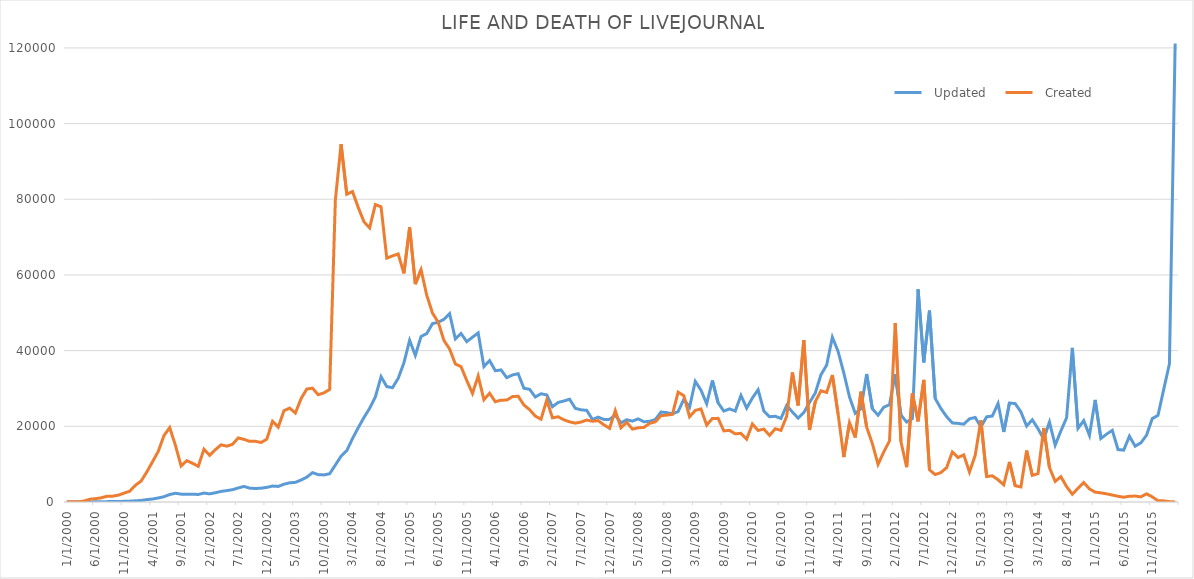
| Category |   Updated |   Created |
|---|---|---|
| 1/1/00 | 3 | 50 |
| 2/1/00 | 9 | 66 |
| 3/1/00 | 7 | 73 |
| 4/1/00 | 8 | 251 |
| 5/1/00 | 20 | 733 |
| 6/1/00 | 39 | 881 |
| 7/1/00 | 63 | 1099 |
| 8/1/00 | 98 | 1513 |
| 9/1/00 | 110 | 1538 |
| 10/1/00 | 137 | 1800 |
| 11/1/00 | 170 | 2334 |
| 12/1/00 | 219 | 2844 |
| 1/1/01 | 314 | 4431 |
| 2/1/01 | 406 | 5539 |
| 3/1/01 | 633 | 7948 |
| 4/1/01 | 791 | 10648 |
| 5/1/01 | 1067 | 13389 |
| 6/1/01 | 1399 | 17559 |
| 7/1/01 | 1977 | 19659 |
| 8/1/01 | 2307 | 14999 |
| 9/1/01 | 2081 | 9531 |
| 10/1/01 | 2029 | 10918 |
| 11/1/01 | 2066 | 10225 |
| 12/1/01 | 1989 | 9430 |
| 1/1/02 | 2359 | 13959 |
| 2/1/02 | 2150 | 12333 |
| 3/1/02 | 2445 | 13839 |
| 4/1/02 | 2801 | 15112 |
| 5/1/02 | 3018 | 14759 |
| 6/1/02 | 3250 | 15256 |
| 7/1/02 | 3707 | 16936 |
| 8/1/02 | 4117 | 16550 |
| 9/1/02 | 3664 | 16032 |
| 10/1/02 | 3564 | 16030 |
| 11/1/02 | 3642 | 15731 |
| 12/1/02 | 3874 | 16600 |
| 1/1/03 | 4209 | 21334 |
| 2/1/03 | 4115 | 19782 |
| 3/1/03 | 4700 | 24133 |
| 4/1/03 | 5074 | 24815 |
| 5/1/03 | 5192 | 23511 |
| 6/1/03 | 5810 | 27328 |
| 7/1/03 | 6570 | 29857 |
| 8/1/03 | 7760 | 30085 |
| 9/1/03 | 7233 | 28350 |
| 10/1/03 | 7158 | 28838 |
| 11/1/03 | 7467 | 29750 |
| 12/1/03 | 9768 | 79818 |
| 1/1/04 | 12117 | 94550 |
| 2/1/04 | 13578 | 81351 |
| 3/1/04 | 16749 | 82034 |
| 4/1/04 | 19624 | 77868 |
| 5/1/04 | 22315 | 74090 |
| 6/1/04 | 24747 | 72434 |
| 7/1/04 | 27752 | 78605 |
| 8/1/04 | 33113 | 77989 |
| 9/1/04 | 30498 | 64432 |
| 10/1/04 | 30212 | 65055 |
| 11/1/04 | 32665 | 65548 |
| 12/1/04 | 36785 | 60412 |
| 1/1/05 | 42735 | 72557 |
| 2/1/05 | 38749 | 57570 |
| 3/1/05 | 43744 | 61395 |
| 4/1/05 | 44502 | 54624 |
| 5/1/05 | 47140 | 49949 |
| 6/1/05 | 47498 | 47501 |
| 7/1/05 | 48260 | 42720 |
| 8/1/05 | 49756 | 40428 |
| 9/1/05 | 43107 | 36480 |
| 10/1/05 | 44533 | 35768 |
| 11/1/05 | 42376 | 32105 |
| 12/1/05 | 43548 | 28691 |
| 1/1/06 | 44690 | 33305 |
| 2/1/06 | 35801 | 27020 |
| 3/1/06 | 37361 | 28745 |
| 4/1/06 | 34689 | 26499 |
| 5/1/06 | 34907 | 26913 |
| 6/1/06 | 32859 | 26929 |
| 7/1/06 | 33575 | 27856 |
| 8/1/06 | 33898 | 27958 |
| 9/1/06 | 30062 | 25642 |
| 10/1/06 | 29781 | 24408 |
| 11/1/06 | 27754 | 22707 |
| 12/1/06 | 28609 | 21878 |
| 1/1/07 | 28308 | 26937 |
| 2/1/07 | 25180 | 22241 |
| 3/1/07 | 26313 | 22519 |
| 4/1/07 | 26689 | 21717 |
| 5/1/07 | 27163 | 21186 |
| 6/1/07 | 24755 | 20835 |
| 7/1/07 | 24357 | 21133 |
| 8/1/07 | 24216 | 21656 |
| 9/1/07 | 21815 | 21341 |
| 10/1/07 | 22427 | 21510 |
| 11/1/07 | 21821 | 20400 |
| 12/1/07 | 21837 | 19474 |
| 1/1/08 | 22952 | 24151 |
| 2/1/08 | 20911 | 19598 |
| 3/1/08 | 21738 | 21086 |
| 4/1/08 | 21373 | 19257 |
| 5/1/08 | 21966 | 19607 |
| 6/1/08 | 21196 | 19715 |
| 7/1/08 | 21327 | 20769 |
| 8/1/08 | 21779 | 21183 |
| 9/1/08 | 23779 | 22819 |
| 10/1/08 | 23623 | 22967 |
| 11/1/08 | 23302 | 23163 |
| 12/1/08 | 23901 | 29027 |
| 1/1/09 | 27175 | 28099 |
| 2/1/09 | 25043 | 22517 |
| 3/1/09 | 31881 | 24193 |
| 4/1/09 | 29553 | 24596 |
| 5/1/09 | 25958 | 20324 |
| 6/1/09 | 32120 | 22084 |
| 7/1/09 | 26194 | 22102 |
| 8/1/09 | 24031 | 18792 |
| 9/1/09 | 24602 | 18930 |
| 10/1/09 | 24028 | 18011 |
| 11/1/09 | 28170 | 18145 |
| 12/1/09 | 24809 | 16620 |
| 1/1/10 | 27493 | 20612 |
| 2/1/10 | 29670 | 18903 |
| 3/1/10 | 24048 | 19270 |
| 4/1/10 | 22538 | 17612 |
| 5/1/10 | 22656 | 19359 |
| 6/1/10 | 22072 | 18931 |
| 7/1/10 | 25522 | 22665 |
| 8/1/10 | 23781 | 34253 |
| 9/1/10 | 22171 | 25506 |
| 10/1/10 | 23643 | 42802 |
| 11/1/10 | 26295 | 19026 |
| 12/1/10 | 28770 | 26469 |
| 1/1/11 | 33621 | 29378 |
| 2/1/11 | 36173 | 28961 |
| 3/1/11 | 43543 | 33540 |
| 4/1/11 | 39793 | 23261 |
| 5/1/11 | 34106 | 11859 |
| 6/1/11 | 27758 | 20940 |
| 7/1/11 | 23435 | 17037 |
| 8/1/11 | 24647 | 29154 |
| 9/1/11 | 33819 | 19818 |
| 10/1/11 | 24629 | 15435 |
| 11/1/11 | 22941 | 9930 |
| 12/1/11 | 25050 | 13237 |
| 1/1/12 | 25701 | 16138 |
| 2/1/12 | 33756 | 47277 |
| 3/1/12 | 22974 | 15960 |
| 4/1/12 | 21106 | 9190 |
| 5/1/12 | 22052 | 28730 |
| 6/1/12 | 56216 | 21306 |
| 7/1/12 | 36912 | 32275 |
| 8/1/12 | 50577 | 8510 |
| 9/1/12 | 27347 | 7243 |
| 10/1/12 | 24703 | 7775 |
| 11/1/12 | 22553 | 9095 |
| 12/1/12 | 20893 | 13216 |
| 1/1/13 | 20770 | 11754 |
| 2/1/13 | 20573 | 12452 |
| 3/1/13 | 21980 | 7923 |
| 4/1/13 | 22338 | 12331 |
| 5/1/13 | 19829 | 21584 |
| 6/1/13 | 22512 | 6739 |
| 7/1/13 | 22709 | 6911 |
| 8/1/13 | 26026 | 5865 |
| 9/1/13 | 18501 | 4530 |
| 10/1/13 | 26161 | 10587 |
| 11/1/13 | 26004 | 4294 |
| 12/1/13 | 23810 | 3983 |
| 1/1/14 | 20076 | 13592 |
| 2/1/14 | 21723 | 7022 |
| 3/1/14 | 19355 | 7517 |
| 4/1/14 | 16620 | 19555 |
| 5/1/14 | 21110 | 9116 |
| 6/1/14 | 15017 | 5439 |
| 7/1/14 | 18787 | 6684 |
| 8/1/14 | 22262 | 4067 |
| 9/1/14 | 40710 | 2050 |
| 10/1/14 | 19438 | 3637 |
| 11/1/14 | 21493 | 5141 |
| 12/1/14 | 17635 | 3469 |
| 1/1/15 | 26983 | 2607 |
| 2/1/15 | 16792 | 2412 |
| 3/1/15 | 17944 | 2155 |
| 4/1/15 | 18947 | 1837 |
| 5/1/15 | 13876 | 1514 |
| 6/1/15 | 13717 | 1261 |
| 7/1/15 | 17394 | 1528 |
| 8/1/15 | 14763 | 1564 |
| 9/1/15 | 15648 | 1359 |
| 10/1/15 | 17700 | 2157 |
| 11/1/15 | 22035 | 1343 |
| 12/1/15 | 22903 | 340 |
| 1/1/16 | 29765 | 294 |
| 2/1/16 | 36506 | 86 |
| 3/1/16 | 121150 | 16 |